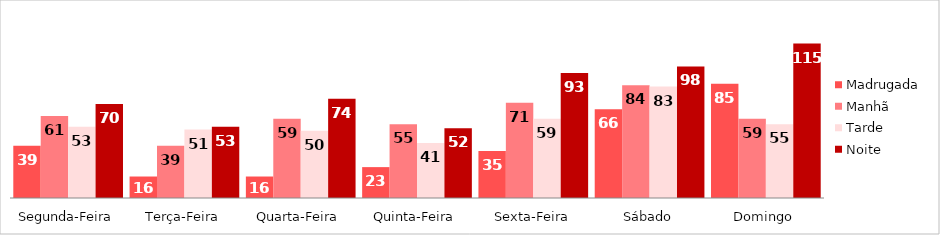
| Category | Madrugada | Manhã | Tarde | Noite |
|---|---|---|---|---|
| Segunda-Feira | 39 | 61 | 53 | 70 |
| Terça-Feira | 16 | 39 | 51 | 53 |
| Quarta-Feira | 16 | 59 | 50 | 74 |
| Quinta-Feira | 23 | 55 | 41 | 52 |
| Sexta-Feira | 35 | 71 | 59 | 93 |
| Sábado | 66 | 84 | 83 | 98 |
| Domingo | 85 | 59 | 55 | 115 |